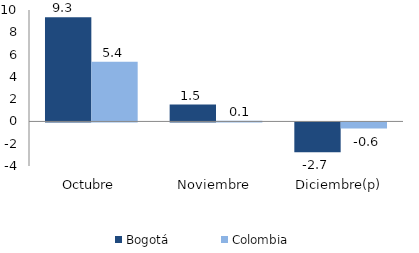
| Category | Bogotá | Colombia |
|---|---|---|
| Octubre | 9.348 | 5.35 |
| Noviembre | 1.511 | 0.067 |
| Diciembre(p) | -2.679 | -0.552 |